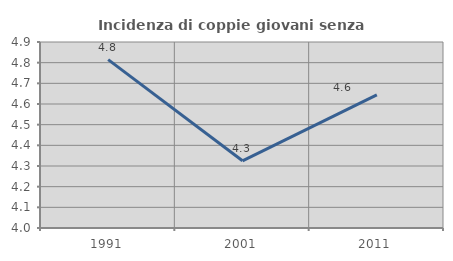
| Category | Incidenza di coppie giovani senza figli |
|---|---|
| 1991.0 | 4.815 |
| 2001.0 | 4.325 |
| 2011.0 | 4.644 |